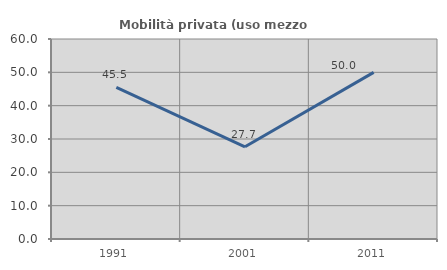
| Category | Mobilità privata (uso mezzo privato) |
|---|---|
| 1991.0 | 45.455 |
| 2001.0 | 27.66 |
| 2011.0 | 50 |